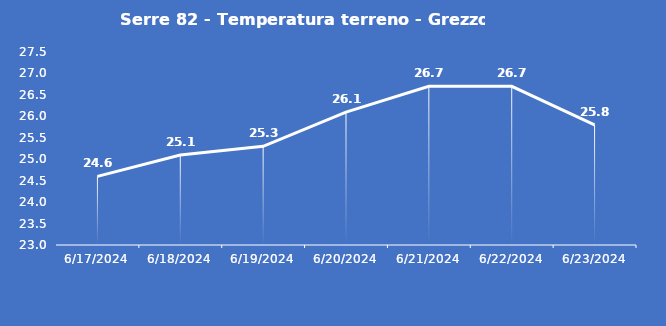
| Category | Serre 82 - Temperatura terreno - Grezzo (°C) |
|---|---|
| 6/17/24 | 24.6 |
| 6/18/24 | 25.1 |
| 6/19/24 | 25.3 |
| 6/20/24 | 26.1 |
| 6/21/24 | 26.7 |
| 6/22/24 | 26.7 |
| 6/23/24 | 25.8 |